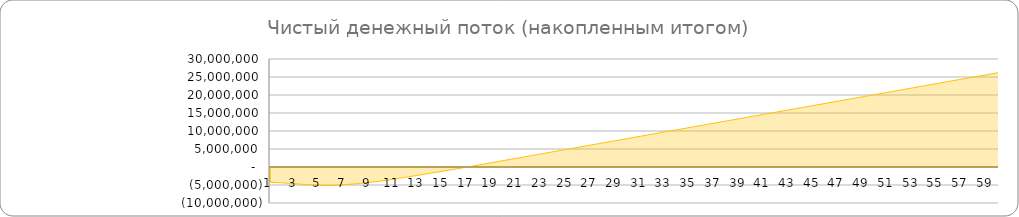
| Category | Номер периода | Чистый денежный поток (накопленным итогом) | Series 2 | Series 3 |
|---|---|---|---|---|
| 0 | 1 | -4210000 |  | -1.052 |
| 1 | 2 | -4420000 |  | -0.052 |
| 2 | 3 | -4630000 |  | -0.052 |
| 3 | 4 | -4905586.667 |  | -0.069 |
| 4 | 5 | -5089872.333 |  | -0.046 |
| 5 | 6 | -5144393.75 |  | -0.014 |
| 6 | 7 | -4921804.824 |  | 0.056 |
| 7 | 8 | -4657331.848 |  | 0.066 |
| 8 | 9 | -4304166.233 |  | 0.088 |
| 9 | 10 | -3874651.236 |  | 0.107 |
| 10 | 11 | -3387699.358 |  | 0.122 |
| 11 | 12 | -2841062.568 |  | 0.137 |
| 12 | 13 | -2285612.743 |  | 0.139 |
| 13 | 14 | -1721261.752 |  | 0.141 |
| 14 | 15 | -1147920.586 |  | 0.143 |
| 15 | 16 | -571416.037 |  | 0.144 |
| 16 | 17 | 20176.087 |  | 0.148 |
| 17 | 18 | 621030.799 |  | 0.15 |
| 18 | 19 | 1231240.725 |  | 0.153 |
| 19 | 20 | 1841574.058 |  | 0.153 |
| 20 | 21 | 2451907.392 |  | 0.153 |
| 21 | 22 | 3062240.725 |  | 0.153 |
| 22 | 23 | 3672574.058 |  | 0.153 |
| 23 | 24 | 4282907.392 |  | 0.153 |
| 24 | 25 | 4893240.725 |  | 0.153 |
| 25 | 26 | 5503574.058 |  | 0.153 |
| 26 | 27 | 6113907.392 |  | 0.153 |
| 27 | 28 | 6718143.951 |  | 0.151 |
| 28 | 29 | 7328477.284 |  | 0.153 |
| 29 | 30 | 7938810.618 |  | 0.153 |
| 30 | 31 | 8549143.951 |  | 0.153 |
| 31 | 32 | 9159477.284 |  | 0.153 |
| 32 | 33 | 9769810.618 |  | 0.153 |
| 33 | 34 | 10380143.951 |  | 0.153 |
| 34 | 35 | 10990477.284 |  | 0.153 |
| 35 | 36 | 11600810.618 |  | 0.153 |
| 36 | 37 | 12211143.951 |  | 0.153 |
| 37 | 38 | 12821477.284 |  | 0.153 |
| 38 | 39 | 13431810.618 |  | 0.153 |
| 39 | 40 | 14036047.177 |  | 0.151 |
| 40 | 41 | 14646380.51 |  | 0.153 |
| 41 | 42 | 15256713.843 |  | 0.153 |
| 42 | 43 | 15867047.177 |  | 0.153 |
| 43 | 44 | 16477380.51 |  | 0.153 |
| 44 | 45 | 17087713.843 |  | 0.153 |
| 45 | 46 | 17698047.177 |  | 0.153 |
| 46 | 47 | 18308380.51 |  | 0.153 |
| 47 | 48 | 18918713.843 |  | 0.153 |
| 48 | 49 | 19529047.177 |  | 0.153 |
| 49 | 50 | 20139380.51 |  | 0.153 |
| 50 | 51 | 20749713.843 |  | 0.153 |
| 51 | 52 | 21360047.177 |  | 0.153 |
| 52 | 53 | 21970380.51 |  | 0.153 |
| 53 | 54 | 22580713.843 |  | 0.153 |
| 54 | 55 | 23191047.177 |  | 0.153 |
| 55 | 56 | 23801380.51 |  | 0.153 |
| 56 | 57 | 24411713.843 |  | 0.153 |
| 57 | 58 | 25022047.177 |  | 0.153 |
| 58 | 59 | 25632380.51 |  | 0.153 |
| 59 | 60 | 26242713.843 |  | 0.153 |